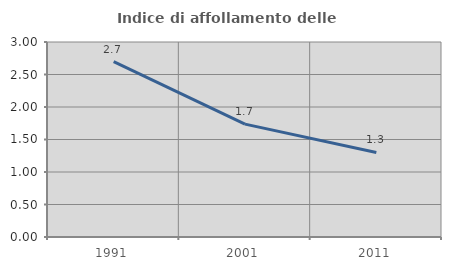
| Category | Indice di affollamento delle abitazioni  |
|---|---|
| 1991.0 | 2.697 |
| 2001.0 | 1.737 |
| 2011.0 | 1.3 |